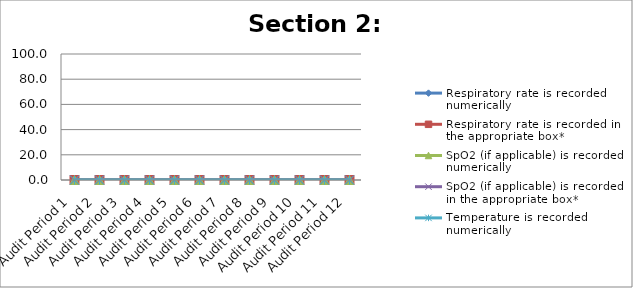
| Category | Respiratory rate is recorded numerically | Respiratory rate is recorded in the appropriate box* | SpO2 (if applicable) is recorded numerically  | SpO2 (if applicable) is recorded in the appropriate box* | Temperature is recorded numerically |
|---|---|---|---|---|---|
| Audit Period 1 | 0 | 0 | 0 | 0 | 0 |
| Audit Period 2 | 0 | 0 | 0 | 0 | 0 |
| Audit Period 3 | 0 | 0 | 0 | 0 | 0 |
| Audit Period 4 | 0 | 0 | 0 | 0 | 0 |
| Audit Period 5 | 0 | 0 | 0 | 0 | 0 |
| Audit Period 6 | 0 | 0 | 0 | 0 | 0 |
| Audit Period 7 | 0 | 0 | 0 | 0 | 0 |
| Audit Period 8 | 0 | 0 | 0 | 0 | 0 |
| Audit Period 9 | 0 | 0 | 0 | 0 | 0 |
| Audit Period 10 | 0 | 0 | 0 | 0 | 0 |
| Audit Period 11 | 0 | 0 | 0 | 0 | 0 |
| Audit Period 12 | 0 | 0 | 0 | 0 | 0 |